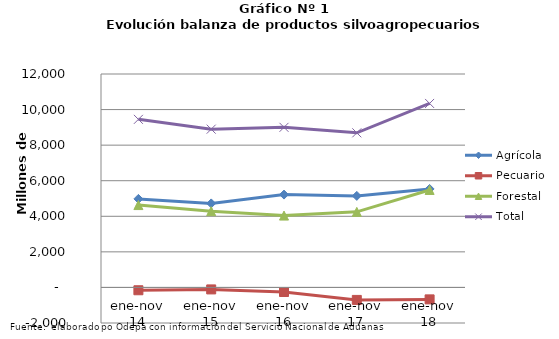
| Category | Agrícola | Pecuario | Forestal | Total |
|---|---|---|---|---|
| ene-nov 14 | 4978654 | -159452 | 4630506 | 9449708 |
| ene-nov 15 | 4723436 | -111336 | 4286694 | 8898794 |
| ene-nov 16 | 5219972 | -257489 | 4039087 | 9001570 |
| ene-nov 17 | 5146482 | -702333 | 4248721 | 8692870 |
| ene-nov 18 | 5536414 | -672071 | 5480118 | 10344461 |